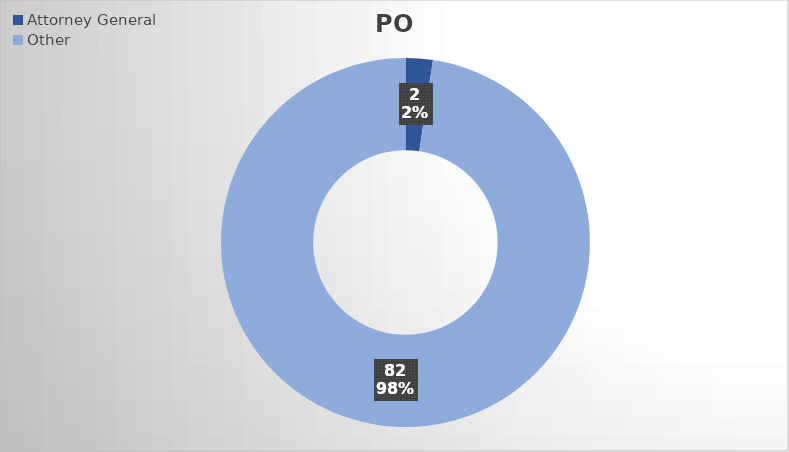
| Category | PO Lines |
|---|---|
| Attorney General | 2 |
| Other | 82 |